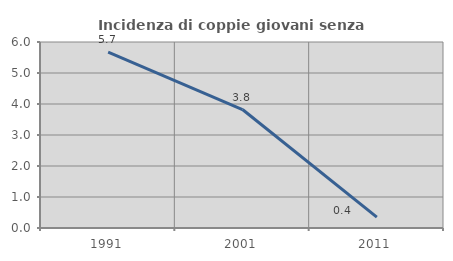
| Category | Incidenza di coppie giovani senza figli |
|---|---|
| 1991.0 | 5.672 |
| 2001.0 | 3.822 |
| 2011.0 | 0.351 |